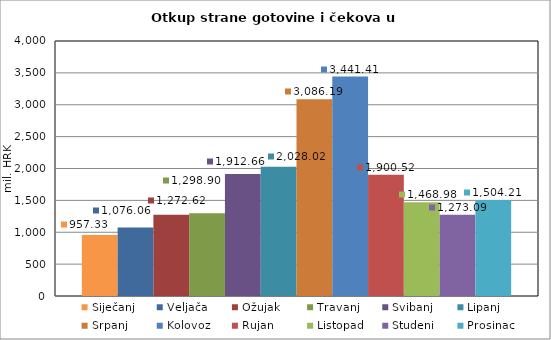
| Category | Siječanj | Veljača | Ožujak | Travanj | Svibanj | Lipanj | Srpanj | Kolovoz | Rujan | Listopad | Studeni | Prosinac |
|---|---|---|---|---|---|---|---|---|---|---|---|---|
| 0 | 957.332 | 1076.056 | 1272.624 | 1298.896 | 1912.662 | 2028.017 | 3086.192 | 3441.411 | 1900.515 | 1468.983 | 1273.093 | 1504.207 |